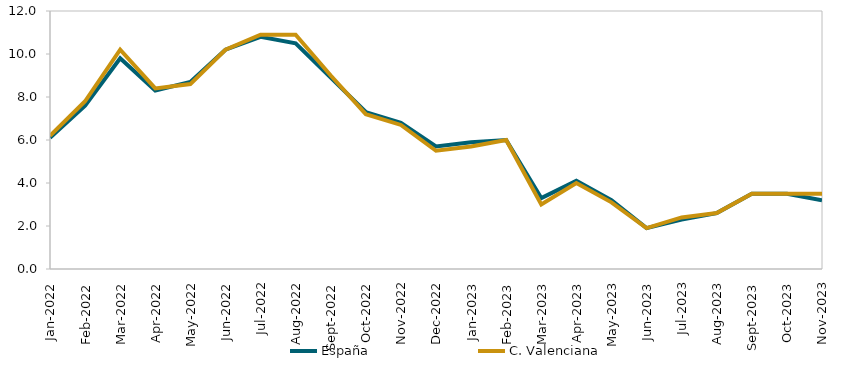
| Category | España | C. Valenciana |
|---|---|---|
| 2022-01-01 | 6.1 | 6.2 |
| 2022-02-01 | 7.6 | 7.8 |
| 2022-03-01 | 9.8 | 10.2 |
| 2022-04-01 | 8.3 | 8.4 |
| 2022-05-01 | 8.7 | 8.6 |
| 2022-06-01 | 10.2 | 10.2 |
| 2022-07-01 | 10.8 | 10.9 |
| 2022-08-01 | 10.5 | 10.9 |
| 2022-09-01 | 8.9 | 9 |
| 2022-10-01 | 7.3 | 7.2 |
| 2022-11-01 | 6.8 | 6.7 |
| 2022-12-01 | 5.7 | 5.5 |
| 2023-01-01 | 5.9 | 5.7 |
| 2023-02-01 | 6 | 6 |
| 2023-03-01 | 3.3 | 3 |
| 2023-04-01 | 4.1 | 4 |
| 2023-05-01 | 3.2 | 3.1 |
| 2023-06-01 | 1.9 | 1.9 |
| 2023-07-01 | 2.3 | 2.4 |
| 2023-08-01 | 2.6 | 2.6 |
| 2023-09-01 | 3.5 | 3.5 |
| 2023-10-01 | 3.5 | 3.5 |
| 2023-11-01 | 3.2 | 3.5 |